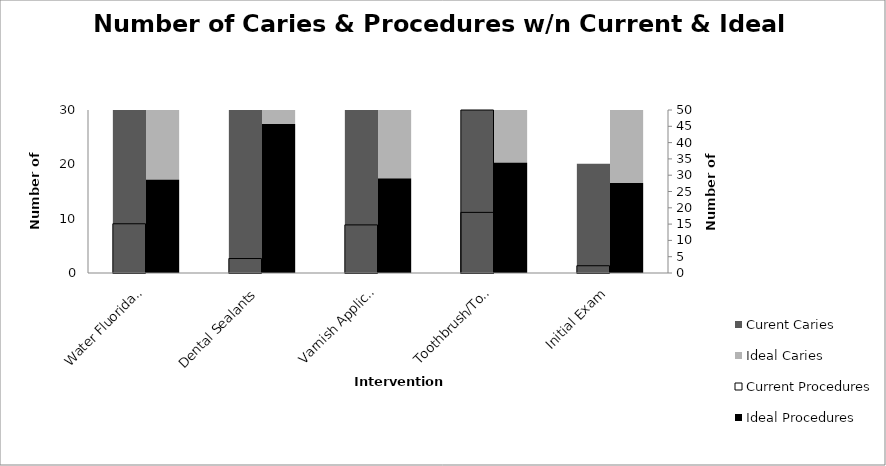
| Category | Curent Caries | Ideal Caries |
|---|---|---|
| Water Fluoridation | 136.388 | 258.242 |
| Dental Sealants | 40.091 | 412.936 |
| Varnish Applications | 133.249 | 261.72 |
| Toothbrush/Toothpaste | 167.937 | 305.34 |
| Initial Exam | 20.124 | 249.072 |